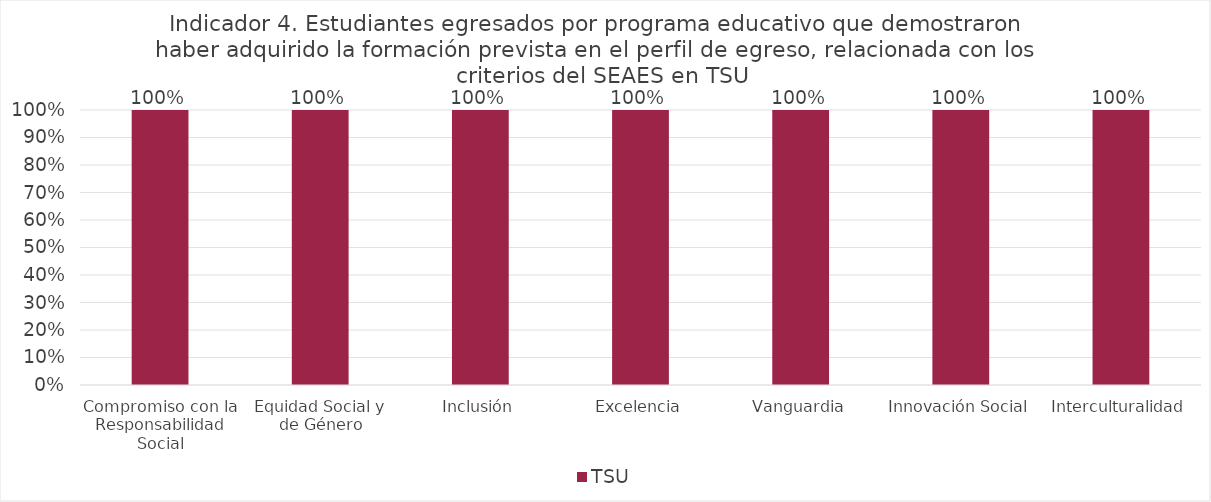
| Category | TSU |
|---|---|
| Compromiso con la Responsabilidad Social | 1 |
| Equidad Social y de Género | 1 |
| Inclusión | 1 |
| Excelencia | 1 |
| Vanguardia | 1 |
| Innovación Social | 1 |
| Interculturalidad | 1 |